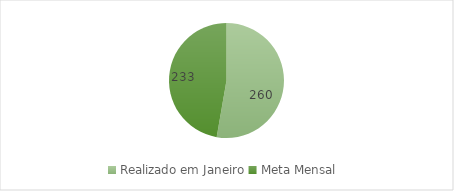
| Category | Series 0 |
|---|---|
| Realizado em Janeiro | 260 |
| Meta Mensal  | 233 |